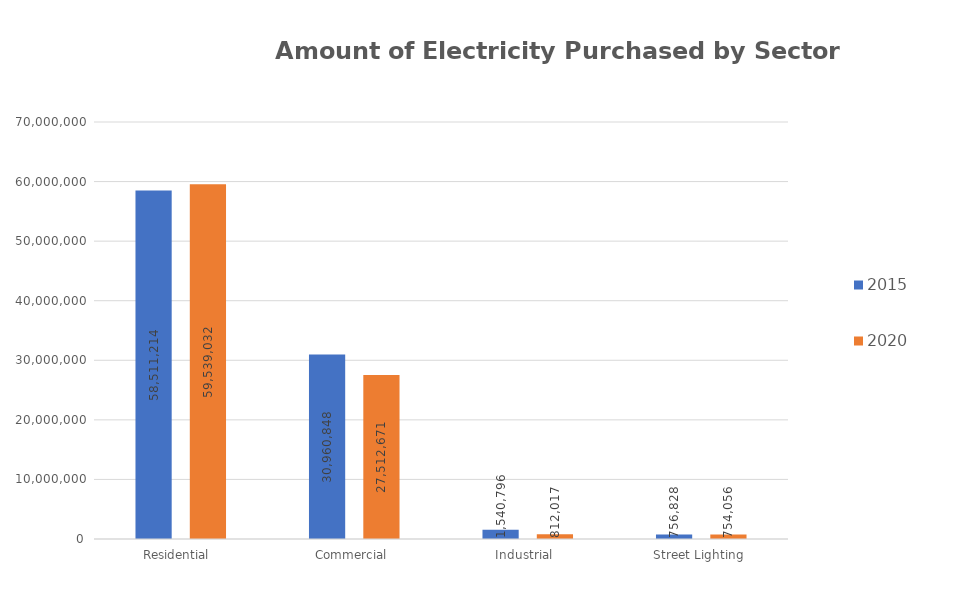
| Category | 2015 | 2020 |
|---|---|---|
| Residential  | 58511214 | 59539032 |
| Commercial  | 30960848 | 27512671 |
| Industrial  | 1540796 | 812017 |
| Street Lighting  | 756828 | 754056 |